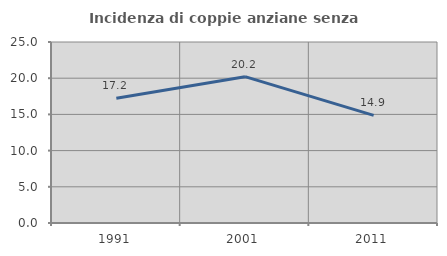
| Category | Incidenza di coppie anziane senza figli  |
|---|---|
| 1991.0 | 17.224 |
| 2001.0 | 20.213 |
| 2011.0 | 14.869 |